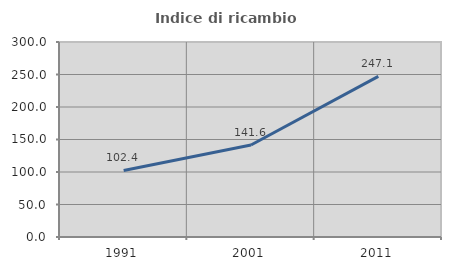
| Category | Indice di ricambio occupazionale  |
|---|---|
| 1991.0 | 102.353 |
| 2001.0 | 141.558 |
| 2011.0 | 247.059 |